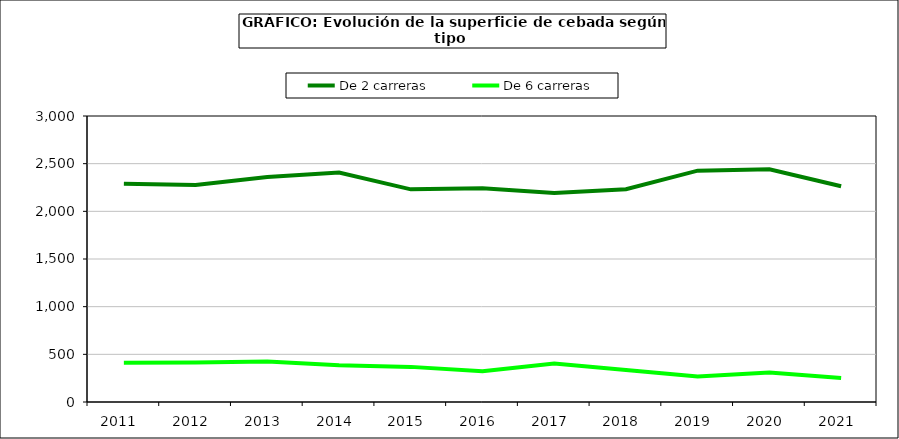
| Category | De 2 carreras | De 6 carreras |
|---|---|---|
| 2011  | 2289.976 | 410.703 |
| 2012  | 2276.855 | 414.231 |
| 2013  | 2360.129 | 424.153 |
| 2014  | 2407.693 | 384.533 |
| 2015  | 2230.462 | 368.434 |
| 2016  | 2241.385 | 321.81 |
| 2017  | 2192.938 | 404.589 |
| 2018  | 2232.782 | 336.68 |
| 2019  | 2426.41 | 267.098 |
| 2020  | 2440.617 | 308.422 |
| 2021  | 2262.889 | 251.672 |